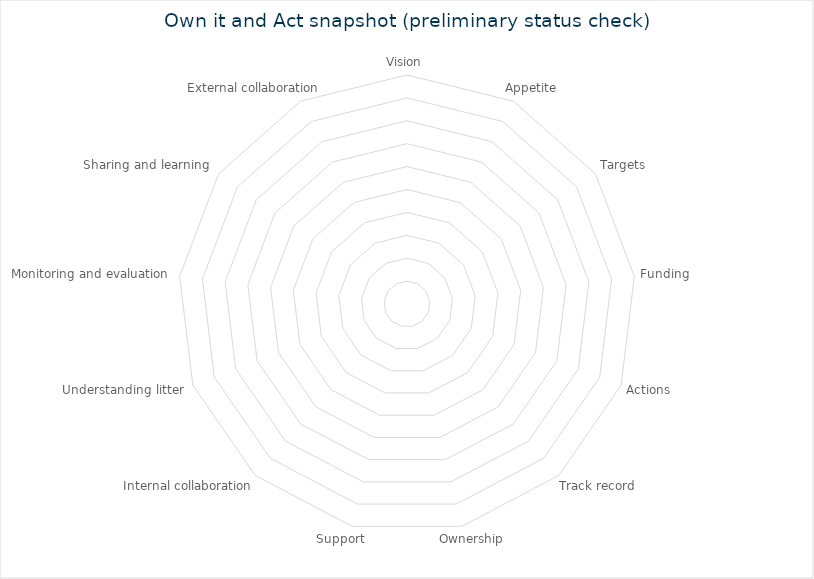
| Category | Input from each question |
|---|---|
| Vision | 0 |
| Appetite | 0 |
| Targets | 0 |
| Funding | 0 |
| Actions | 0 |
| Track record | 0 |
| Ownership | 0 |
| Support | 0 |
| Internal collaboration | 0 |
| Understanding litter | 0 |
| Monitoring and evaluation | 0 |
| Sharing and learning | 0 |
| External collaboration | 0 |